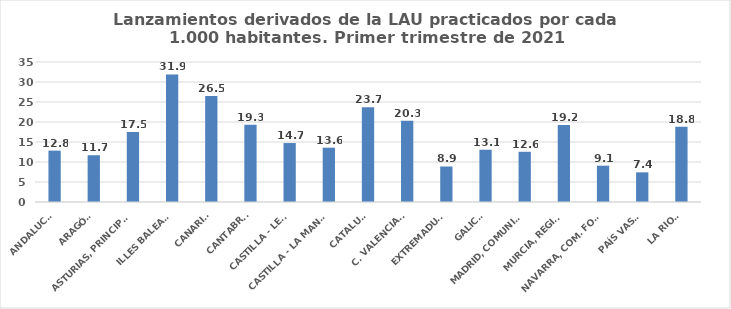
| Category | 616 |
|---|---|
| ANDALUCÍA | 12.843 |
| ARAGÓN | 11.695 |
| ASTURIAS, PRINCIPADO | 17.498 |
| ILLES BALEARS | 31.902 |
| CANARIAS | 26.527 |
| CANTABRIA | 19.339 |
| CASTILLA - LEÓN | 14.74 |
| CASTILLA - LA MANCHA | 13.576 |
| CATALUÑA | 23.656 |
| C. VALENCIANA | 20.299 |
| EXTREMADURA | 8.878 |
| GALICIA | 13.065 |
| MADRID, COMUNIDAD | 12.556 |
| MURCIA, REGIÓN | 19.237 |
| NAVARRA, COM. FORAL | 9.077 |
| PAÍS VASCO | 7.412 |
| LA RIOJA | 18.796 |